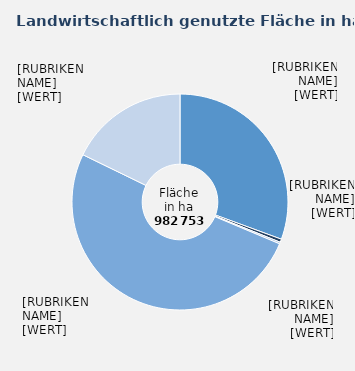
| Category | Series 0 |
|---|---|
| Ackerbaubetriebe | 30.602 |
| Gartenbaubetriebe | 0.474 |
| Dauerkulturbetriebe | 0.258 |
| Futterbaubetriebe | 50.879 |
| Veredlungs- und Verbundbetriebe | 17.787 |